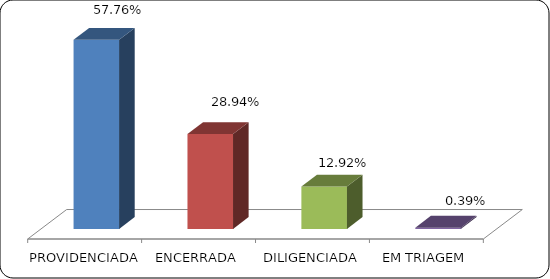
| Category | Series 0 |
|---|---|
| PROVIDENCIADA | 0.578 |
| ENCERRADA | 0.289 |
| DILIGENCIADA | 0.129 |
| EM TRIAGEM | 0.004 |